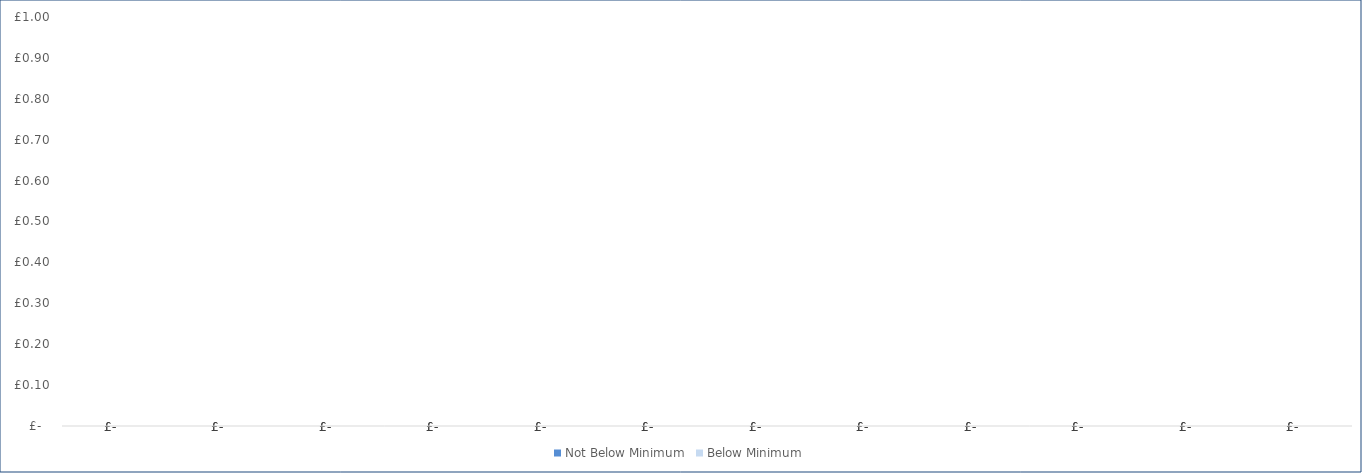
| Category |  Not Below Minimum  |  Below Minimum  |
|---|---|---|
| 0 | 0 | 0 |
| 1900-01-01 | 0 | 0 |
| 1900-01-02 | 0 | 0 |
| 1900-01-03 | 0 | 0 |
| 1900-01-04 | 0 | 0 |
| 1900-01-05 | 0 | 0 |
| 1900-01-06 | 0 | 0 |
| 1900-01-07 | 0 | 0 |
| 1900-01-08 | 0 | 0 |
| 1900-01-09 | 0 | 0 |
| 1900-01-10 | 0 | 0 |
| 1900-01-11 | 0 | 0 |